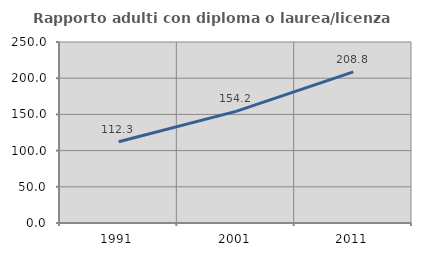
| Category | Rapporto adulti con diploma o laurea/licenza media  |
|---|---|
| 1991.0 | 112.276 |
| 2001.0 | 154.178 |
| 2011.0 | 208.833 |